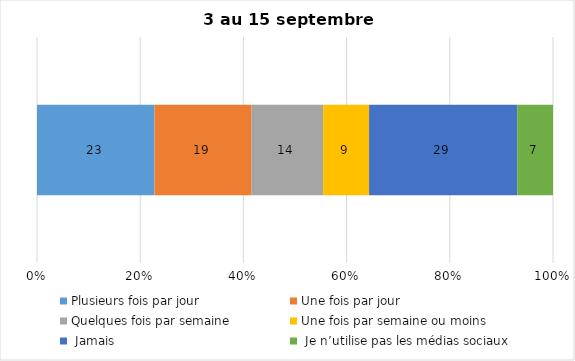
| Category | Plusieurs fois par jour | Une fois par jour | Quelques fois par semaine   | Une fois par semaine ou moins   |  Jamais   |  Je n’utilise pas les médias sociaux |
|---|---|---|---|---|---|---|
| 0 | 23 | 19 | 14 | 9 | 29 | 7 |